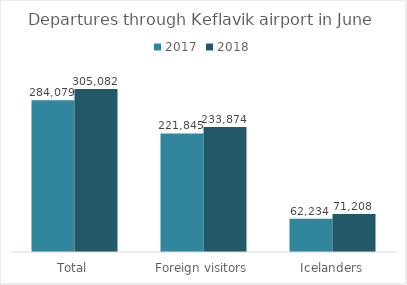
| Category | 2017 | 2018 |
|---|---|---|
| Total | 284079 | 305082 |
| Foreign visitors | 221845 | 233874 |
| Icelanders | 62234 | 71208 |